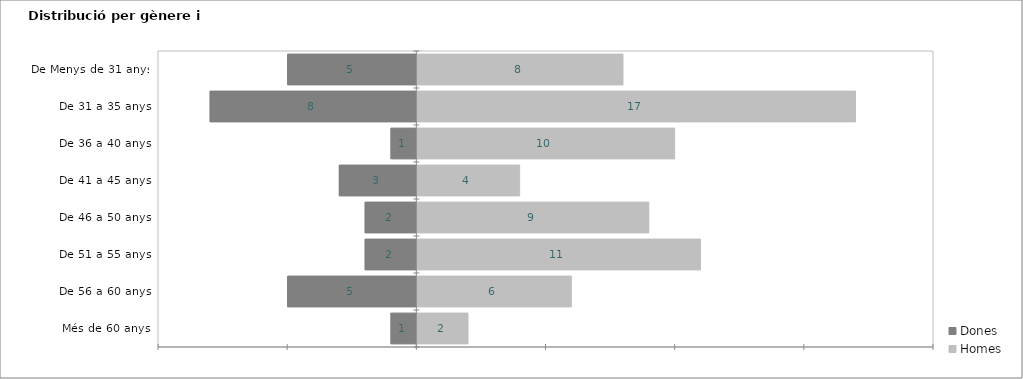
| Category | Dones | Homes |
|---|---|---|
| Més de 60 anys | -1 | 2 |
| De 56 a 60 anys | -5 | 6 |
| De 51 a 55 anys | -2 | 11 |
| De 46 a 50 anys | -2 | 9 |
| De 41 a 45 anys | -3 | 4 |
| De 36 a 40 anys | -1 | 10 |
| De 31 a 35 anys | -8 | 17 |
| De Menys de 31 anys | -5 | 8 |